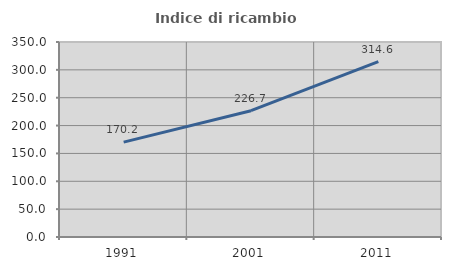
| Category | Indice di ricambio occupazionale  |
|---|---|
| 1991.0 | 170.233 |
| 2001.0 | 226.711 |
| 2011.0 | 314.615 |